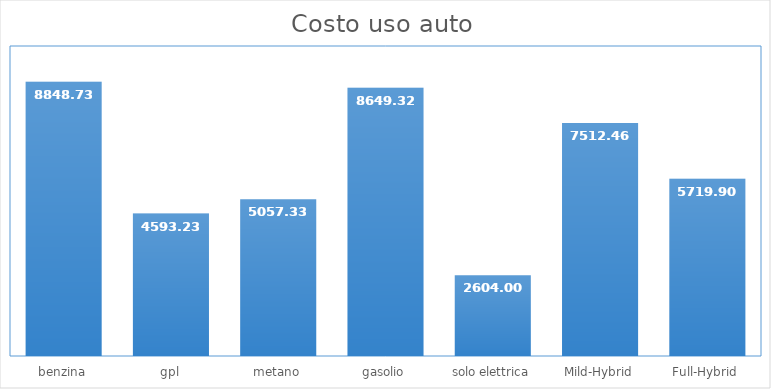
| Category | Series 0 |
|---|---|
| benzina | 8848.728 |
| gpl | 4593.225 |
| metano | 5057.325 |
| gasolio | 8649.322 |
| solo elettrica | 2604 |
| Mild-Hybrid | 7512.456 |
| Full-Hybrid | 5719.896 |